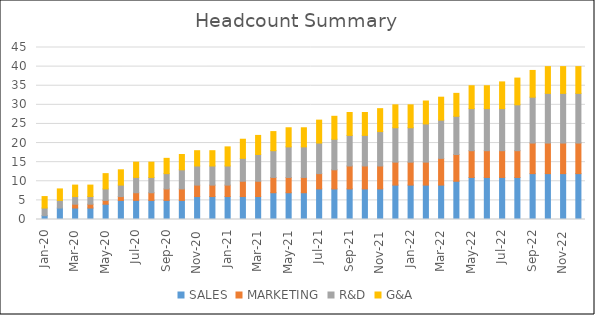
| Category | SALES | MARKETING | R&D | G&A |
|---|---|---|---|---|
| 2020-01-01 | 1 | 0 | 2 | 3 |
| 2020-02-29 | 3 | 0 | 2 | 3 |
| 2020-03-31 | 3 | 1 | 2 | 3 |
| 2020-04-30 | 3 | 1 | 2 | 3 |
| 2020-05-31 | 4 | 1 | 3 | 4 |
| 2020-06-30 | 5 | 1 | 3 | 4 |
| 2020-07-31 | 5 | 2 | 4 | 4 |
| 2020-08-31 | 5 | 2 | 4 | 4 |
| 2020-09-30 | 5 | 3 | 4 | 4 |
| 2020-10-31 | 5 | 3 | 5 | 4 |
| 2020-11-30 | 6 | 3 | 5 | 4 |
| 2020-12-31 | 6 | 3 | 5 | 4 |
| 2021-01-31 | 6 | 3 | 5 | 5 |
| 2021-02-28 | 6 | 4 | 6 | 5 |
| 2021-03-31 | 6 | 4 | 7 | 5 |
| 2021-04-30 | 7 | 4 | 7 | 5 |
| 2021-05-31 | 7 | 4 | 8 | 5 |
| 2021-06-30 | 7 | 4 | 8 | 5 |
| 2021-07-31 | 8 | 4 | 8 | 6 |
| 2021-08-31 | 8 | 5 | 8 | 6 |
| 2021-09-30 | 8 | 6 | 8 | 6 |
| 2021-10-31 | 8 | 6 | 8 | 6 |
| 2021-11-30 | 8 | 6 | 9 | 6 |
| 2021-12-31 | 9 | 6 | 9 | 6 |
| 2022-01-31 | 9 | 6 | 9 | 6 |
| 2022-02-28 | 9 | 6 | 10 | 6 |
| 2022-03-31 | 9 | 7 | 10 | 6 |
| 2022-04-30 | 10 | 7 | 10 | 6 |
| 2022-05-31 | 11 | 7 | 11 | 6 |
| 2022-06-30 | 11 | 7 | 11 | 6 |
| 2022-07-31 | 11 | 7 | 11 | 7 |
| 2022-08-31 | 11 | 7 | 12 | 7 |
| 2022-09-30 | 12 | 8 | 12 | 7 |
| 2022-10-31 | 12 | 8 | 13 | 7 |
| 2022-11-30 | 12 | 8 | 13 | 7 |
| 2022-12-31 | 12 | 8 | 13 | 7 |